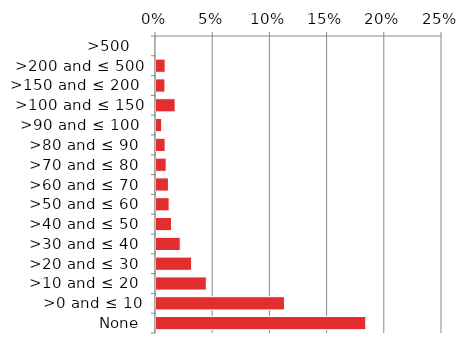
| Category | Non native |
|---|---|
|  None | 0.184 |
| >0 and ≤ 10 | 0.113 |
| >10 and ≤ 20  | 0.045 |
| >20 and ≤ 30  | 0.032 |
| >30 and ≤ 40  | 0.022 |
| >40 and ≤ 50  | 0.014 |
| >50 and ≤ 60  | 0.012 |
| >60 and ≤ 70  | 0.012 |
| >70 and ≤ 80  | 0.01 |
| >80 and ≤ 90  | 0.009 |
| >90 and ≤ 100  | 0.006 |
| >100 and ≤ 150 | 0.018 |
| >150 and ≤ 200  | 0.009 |
| >200 and ≤ 500 | 0.009 |
| >500   | 0 |